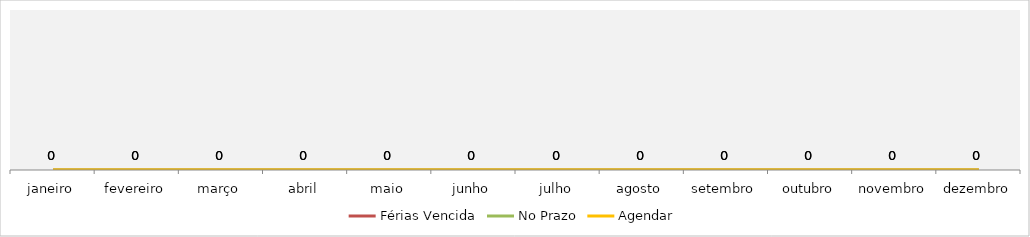
| Category | Férias Vencida | No Prazo | Agendar |
|---|---|---|---|
| janeiro | 0 | 0 | 0 |
| fevereiro | 0 | 0 | 0 |
| março | 0 | 0 | 0 |
| abril | 0 | 0 | 0 |
| maio | 0 | 0 | 0 |
| junho | 0 | 0 | 0 |
| julho | 0 | 0 | 0 |
| agosto | 0 | 0 | 0 |
| setembro | 0 | 0 | 0 |
| outubro | 0 | 0 | 0 |
| novembro | 0 | 0 | 0 |
| dezembro | 0 | 0 | 0 |